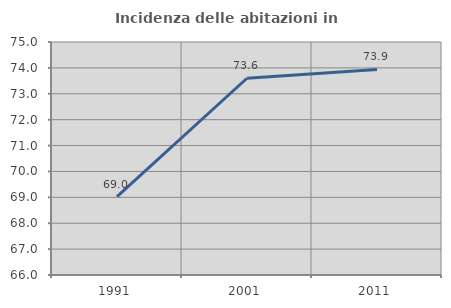
| Category | Incidenza delle abitazioni in proprietà  |
|---|---|
| 1991.0 | 69.029 |
| 2001.0 | 73.6 |
| 2011.0 | 73.939 |